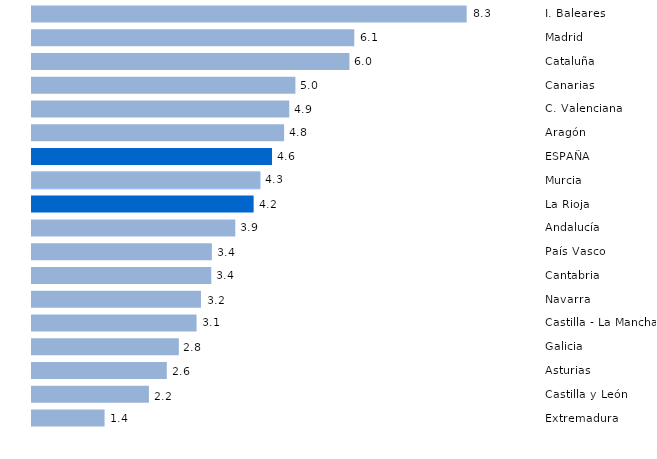
| Category | Series 0 |
|---|---|
| Extremadura | 1.381 |
| Castilla y León | 2.225 |
| Asturias  | 2.565 |
| Galicia | 2.794 |
| Castilla - La Mancha | 3.131 |
| Navarra  | 3.215 |
| Cantabria | 3.411 |
| País Vasco | 3.422 |
| Andalucía | 3.868 |
| La Rioja | 4.217 |
| Murcia | 4.339 |
| ESPAÑA | 4.567 |
| Aragón | 4.797 |
| C. Valenciana | 4.895 |
| Canarias | 5.012 |
| Cataluña | 6.04 |
| Madrid | 6.132 |
| I. Baleares | 8.271 |